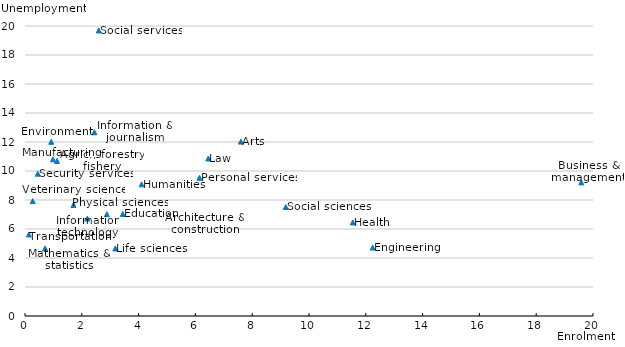
| Category | Unemployment |
|---|---|
| 1.12895413390961 | 10.696 |
| 2.88308973072838 | 7.018 |
| 7.60165262181829 | 12.028 |
| 3.17982772183819 | 4.658 |
| 19.5892769392893 | 9.215 |
| 1.70654222558414 | 7.658 |
| 9.18165412624687 | 7.52 |
| 0.270797143272919 | 7.924 |
| 6.45442038374177 | 10.864 |
| 12.2414087637885 | 4.72 |
| 3.44310272224241 | 7.037 |
| 4.10561369789246 | 9.079 |
| 0.985189814596753 | 10.804 |
| 2.44413402911983 | 12.67 |
| 2.19414580443694 | 6.719 |
| 0.707432931660278 | 4.662 |
| 0.923536363233734 | 12.012 |
| 11.5419197774008 | 6.456 |
| 0.449781963307409 | 9.813 |
| 0.136171876043522 | 5.626 |
| 6.14516892131768 | 9.532 |
| 2.59605319490716 | 19.692 |